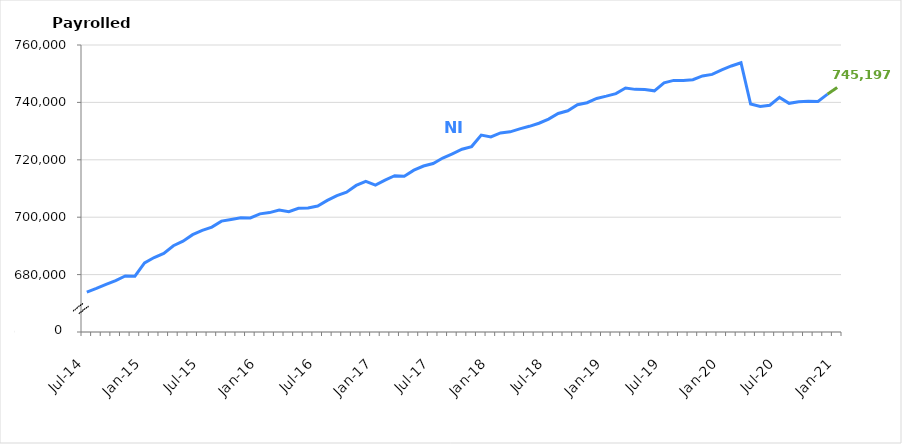
| Category | NI |
|---|---|
| Jul-14 | 673883 |
| Aug-14 | 675169 |
| Sep-14 | 676569 |
| Oct-14 | 677935 |
| Nov-14 | 679516 |
| Dec-14 | 679467 |
| Jan-15 | 684050 |
| Feb-15 | 685957 |
| Mar-15 | 687412 |
| Apr-15 | 690066 |
| May-15 | 691656 |
| Jun-15 | 693906 |
| Jul-15 | 695380 |
| Aug-15 | 696565 |
| Sep-15 | 698633 |
| Oct-15 | 699211 |
| Nov-15 | 699810 |
| Dec-15 | 699731 |
| Jan-16 | 701155 |
| Feb-16 | 701608 |
| Mar-16 | 702518 |
| Apr-16 | 701905 |
| May-16 | 703109 |
| Jun-16 | 703208 |
| Jul-16 | 703900 |
| Aug-16 | 705846 |
| Sep-16 | 707545 |
| Oct-16 | 708738 |
| Nov-16 | 711068 |
| Dec-16 | 712522 |
| Jan-17 | 711211 |
| Feb-17 | 712927 |
| Mar-17 | 714448 |
| Apr-17 | 714279 |
| May-17 | 716387 |
| Jun-17 | 717834 |
| Jul-17 | 718702 |
| Aug-17 | 720617 |
| Sep-17 | 722104 |
| Oct-17 | 723674 |
| Nov-17 | 724609 |
| Dec-17 | 728625 |
| Jan-18 | 727956 |
| Feb-18 | 729351 |
| Mar-18 | 729736 |
| Apr-18 | 730768 |
| May-18 | 731665 |
| Jun-18 | 732746 |
| Jul-18 | 734160 |
| Aug-18 | 736148 |
| Sep-18 | 737071 |
| Oct-18 | 739191 |
| Nov-18 | 739888 |
| Dec-18 | 741386 |
| Jan-19 | 742179 |
| Feb-19 | 743074 |
| Mar-19 | 745012 |
| Apr-19 | 744542 |
| May-19 | 744471 |
| Jun-19 | 744031 |
| Jul-19 | 746838 |
| Aug-19 | 747661 |
| Sep-19 | 747642 |
| Oct-19 | 747891 |
| Nov-19 | 749219 |
| Dec-19 | 749754 |
| Jan-20 | 751353 |
| Feb-20 | 752690 |
| Mar-20 | 753820 |
| Apr-20 | 739445 |
| May-20 | 738575 |
| Jun-20 | 739008 |
| Jul-20 | 741743 |
| Aug-20 | 739680 |
| Sep-20 | 740253 |
| Oct-20 | 740375 |
| Nov-20 | 740355 |
| Dec-20 | 742887 |
| Jan-21 | 745197 |